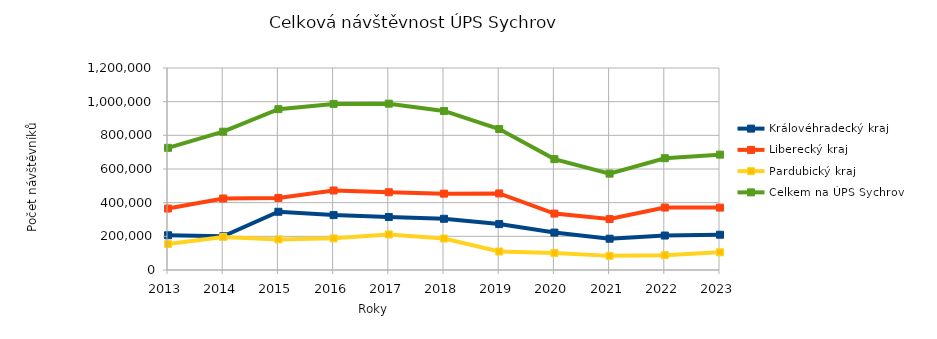
| Category | Královéhradecký kraj | Liberecký kraj | Pardubický kraj | Celkem na ÚPS Sychrov |
|---|---|---|---|---|
| 2013.0 | 206419 | 365108 | 154165 | 725692 |
| 2014.0 | 200438 | 424718 | 196473 | 821629 |
| 2015.0 | 345970 | 428023 | 181567 | 955560 |
| 2016.0 | 326137 | 472318 | 188108 | 986563 |
| 2017.0 | 314983 | 461803 | 211268 | 988054 |
| 2018.0 | 304267 | 453568 | 187017 | 944852 |
| 2019.0 | 272720 | 454785 | 109949 | 837454 |
| 2020.0 | 222238 | 335261 | 101211 | 658710 |
| 2021.0 | 185934 | 302574 | 83925 | 572433 |
| 2022.0 | 204678 | 371041 | 88282 | 664001 |
| 2023.0 | 209505 | 370549 | 105195 | 685249 |